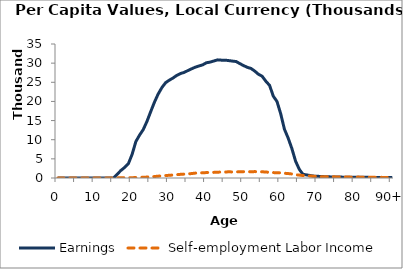
| Category | Earnings | Self-employment Labor Income |
|---|---|---|
| 0 | 0 | 0 |
|  | 0 | 0 |
| 2 | 0 | 0 |
| 3 | 0 | 0 |
| 4 | 0 | 0 |
| 5 | 0 | 0 |
| 6 | 0 | 0 |
| 7 | 0 | 0 |
| 8 | 0 | 0 |
| 9 | 0 | 0 |
| 10 | 0 | 0 |
| 11 | 0 | 0 |
| 12 | 0 | 0 |
| 13 | 0 | 0 |
| 14 | 0 | 0 |
| 15 | 0 | 0 |
| 16 | 1015.05 | 38.808 |
| 17 | 1992.641 | 49.104 |
| 18 | 2774.983 | 68.394 |
| 19 | 3771.549 | 92.967 |
| 20 | 6201.513 | 89.906 |
| 21 | 9524.096 | 108.467 |
| 22 | 11206.847 | 156.114 |
| 23 | 12676.275 | 193.177 |
| 24 | 14812.743 | 241.219 |
| 25 | 17333.891 | 313.43 |
| 26 | 19797.464 | 376.453 |
| 27 | 21918.982 | 480.837 |
| 28 | 23602.066 | 546.448 |
| 29 | 24887.034 | 642.412 |
| 30 | 25549.754 | 708.663 |
| 31 | 26110.844 | 781.36 |
| 32 | 26793.915 | 863.754 |
| 33 | 27271.756 | 953.151 |
| 34 | 27585.719 | 1020.402 |
| 35 | 28055.035 | 1084.042 |
| 36 | 28514.129 | 1154.103 |
| 37 | 28940.244 | 1282.159 |
| 38 | 29260.187 | 1293.681 |
| 39 | 29560.661 | 1369.304 |
| 40 | 30102.025 | 1413.948 |
| 41 | 30272.28 | 1479.464 |
| 42 | 30564.982 | 1468.163 |
| 43 | 30854.383 | 1518.133 |
| 44 | 30785.161 | 1562.182 |
| 45 | 30786.675 | 1546.33 |
| 46 | 30666.397 | 1630.013 |
| 47 | 30533.229 | 1574.04 |
| 48 | 30419.993 | 1605.305 |
| 49 | 29872.39 | 1603.804 |
| 50 | 29361.319 | 1661.728 |
| 51 | 28908.576 | 1675.392 |
| 52 | 28612.139 | 1618.091 |
| 53 | 27930.033 | 1674.631 |
| 54 | 27102.525 | 1621.063 |
| 55 | 26580.651 | 1616.738 |
| 56 | 25271.182 | 1572.819 |
| 57 | 24195.623 | 1452.272 |
| 58 | 21382.977 | 1417.046 |
| 59 | 19977.294 | 1345.52 |
| 60 | 16759.125 | 1368.184 |
| 61 | 12746.519 | 1236.888 |
| 62 | 10441.113 | 1159.826 |
| 63 | 7705.77 | 1050.651 |
| 64 | 4404.598 | 860.293 |
| 65 | 2267.459 | 762.127 |
| 66 | 955.013 | 638.242 |
| 67 | 802.668 | 570.438 |
| 68 | 630.962 | 523.887 |
| 69 | 483.239 | 438.82 |
| 70 | 441.461 | 400.328 |
| 71 | 379.119 | 333.437 |
| 72 | 344.809 | 354.502 |
| 73 | 300.65 | 315.863 |
| 74 | 276.527 | 314.753 |
| 75 | 267.446 | 281.225 |
| 76 | 238.818 | 286.571 |
| 77 | 221.318 | 262.941 |
| 78 | 205.514 | 251.307 |
| 79 | 203.908 | 219.475 |
| 80 | 194.974 | 221.405 |
| 81 | 171.68 | 233.144 |
| 82 | 167.312 | 196.139 |
| 83 | 177.645 | 201.523 |
| 84 | 156.027 | 199.745 |
| 85 | 160.612 | 172.337 |
| 86 | 149.656 | 169.433 |
| 87 | 142.591 | 168.913 |
| 88 | 145.734 | 147.663 |
| 89 | 135.285 | 153.98 |
| 90+ | 128.609 | 127.777 |